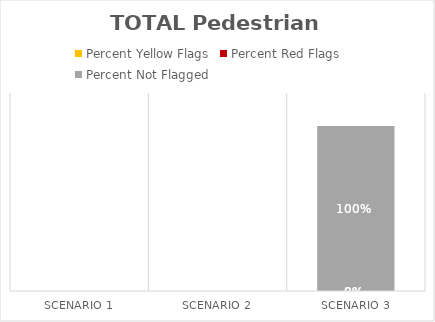
| Category | Percent Yellow Flags | Percent Red Flags | Percent Not Flagged |
|---|---|---|---|
| Scenario 1 | 0 | 0 | 0 |
| Scenario 2 | 0 | 0 | 0 |
| Scenario 3 | 0 | 0 | 1 |